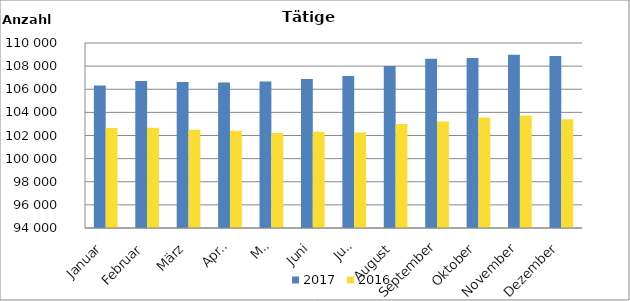
| Category | 2017 | 2016 |
|---|---|---|
| Januar | 106329 | 102641 |
| Februar | 106724 | 102673 |
| März | 106633 | 102494 |
| April | 106573 | 102404 |
| Mai | 106665 | 102218 |
| Juni | 106884 | 102326 |
| Juli | 107146 | 102258 |
| August | 108007 | 102995 |
| September | 108634 | 103209 |
| Oktober | 108701 | 103551 |
| November | 108976 | 103733 |
| Dezember | 108872 | 103404 |